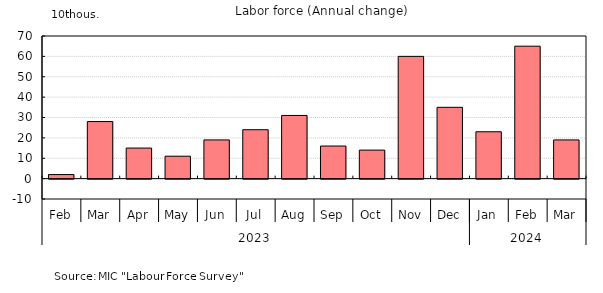
| Category | Series 0 |
|---|---|
| 0 | 2 |
| 1 | 28 |
| 2 | 15 |
| 3 | 11 |
| 4 | 19 |
| 5 | 24 |
| 6 | 31 |
| 7 | 16 |
| 8 | 14 |
| 9 | 60 |
| 10 | 35 |
| 11 | 23 |
| 12 | 65 |
| 13 | 19 |